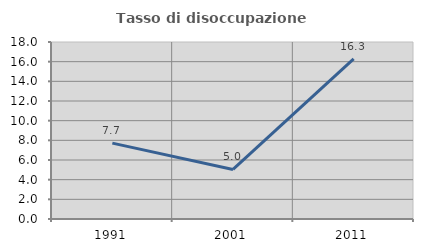
| Category | Tasso di disoccupazione giovanile  |
|---|---|
| 1991.0 | 7.719 |
| 2001.0 | 5.042 |
| 2011.0 | 16.279 |